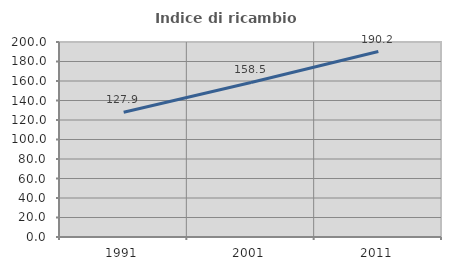
| Category | Indice di ricambio occupazionale  |
|---|---|
| 1991.0 | 127.948 |
| 2001.0 | 158.539 |
| 2011.0 | 190.192 |